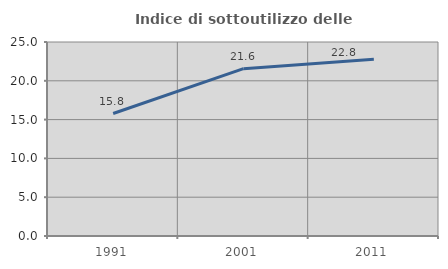
| Category | Indice di sottoutilizzo delle abitazioni  |
|---|---|
| 1991.0 | 15.783 |
| 2001.0 | 21.559 |
| 2011.0 | 22.776 |